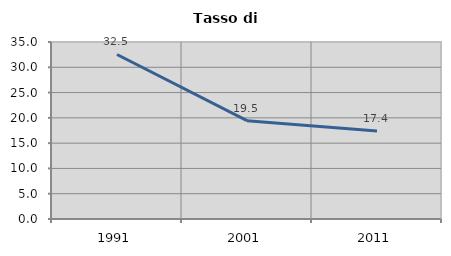
| Category | Tasso di disoccupazione   |
|---|---|
| 1991.0 | 32.53 |
| 2001.0 | 19.451 |
| 2011.0 | 17.418 |